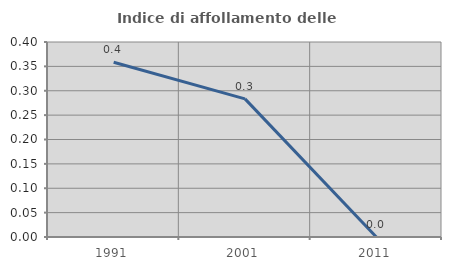
| Category | Indice di affollamento delle abitazioni  |
|---|---|
| 1991.0 | 0.358 |
| 2001.0 | 0.283 |
| 2011.0 | 0 |